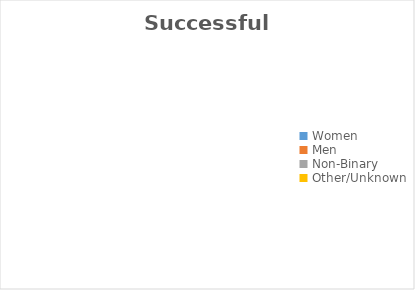
| Category | Successful Outcome |
|---|---|
| Women | 0 |
| Men | 0 |
| Non-Binary | 0 |
| Other/Unknown | 0 |